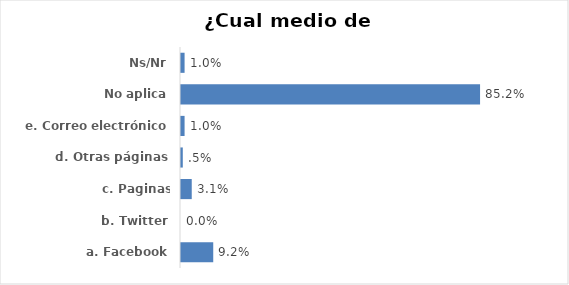
| Category | Series 0 |
|---|---|
| a. Facebook | 0.092 |
| b. Twitter | 0 |
| c. Paginas institucionales | 0.031 |
| d. Otras páginas | 0.005 |
| e. Correo electrónico | 0.01 |
| No aplica | 0.852 |
| Ns/Nr | 0.01 |